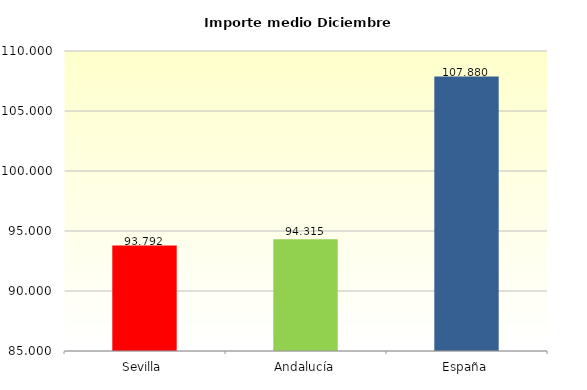
| Category | Series 2 |
|---|---|
| Sevilla | 93.792 |
| Andalucía | 94.315 |
| España | 107.88 |